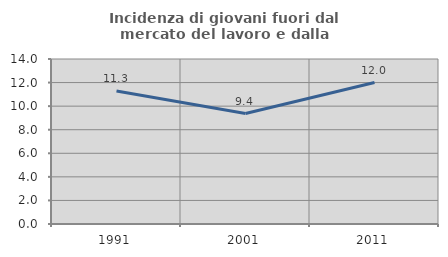
| Category | Incidenza di giovani fuori dal mercato del lavoro e dalla formazione  |
|---|---|
| 1991.0 | 11.29 |
| 2001.0 | 9.375 |
| 2011.0 | 12 |